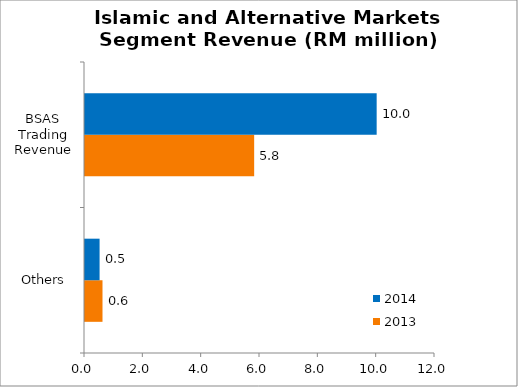
| Category | 2013 | 2014 |
|---|---|---|
| Others  | 0.6 | 0.5 |
| BSAS Trading Revenue | 5.8 | 10 |